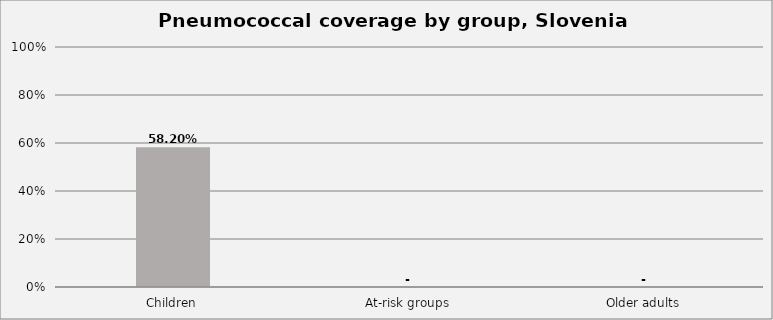
| Category | Series 0 |
|---|---|
| Children | 0.582 |
| At-risk groups | 0 |
| Older adults | 0 |